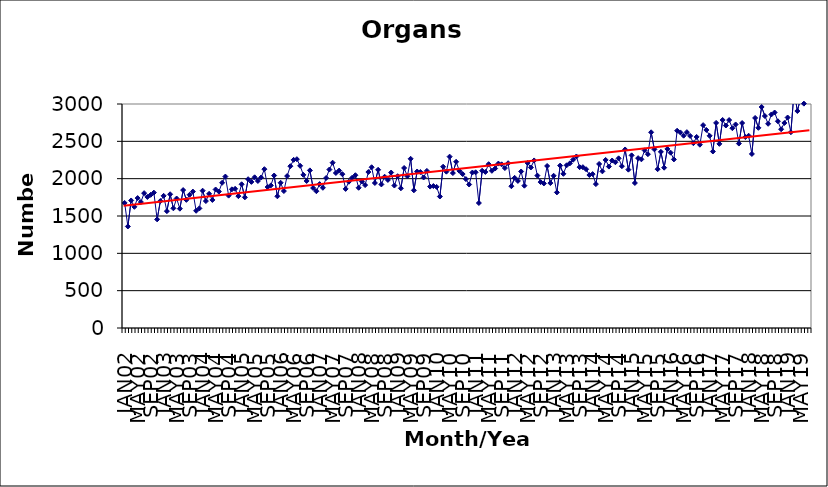
| Category | Series 0 |
|---|---|
| JAN02 | 1675 |
| FEB02 | 1360 |
| MAR02 | 1708 |
| APR02 | 1623 |
| MAY02 | 1740 |
| JUN02 | 1687 |
| JUL02 | 1806 |
| AUG02 | 1755 |
| SEP02 | 1783 |
| OCT02 | 1813 |
| NOV02 | 1455 |
| DEC02 | 1701 |
| JAN03 | 1770 |
| FEB03 | 1565 |
| MAR03 | 1791 |
| APR03 | 1603 |
| MAY03 | 1734 |
| JUN03 | 1598 |
| JUL03 | 1847 |
| AUG03 | 1716 |
| SEP03 | 1785 |
| OCT03 | 1827 |
| NOV03 | 1570 |
| DEC03 | 1602 |
| JAN04 | 1839 |
| FEB04 | 1700 |
| MAR04 | 1797 |
| APR04 | 1715 |
| MAY04 | 1855 |
| JUN04 | 1827 |
| JUL04 | 1945 |
| AUG04 | 2028 |
| SEP04 | 1773 |
| OCT04 | 1857 |
| NOV04 | 1864 |
| DEC04 | 1766 |
| JAN05 | 1925 |
| FEB05 | 1750 |
| MAR05 | 1993 |
| APR05 | 1957 |
| MAY05 | 2018 |
| JUN05 | 1969 |
| JUL05 | 2016 |
| AUG05 | 2127 |
| SEP05 | 1888 |
| OCT05 | 1910 |
| NOV05 | 2042 |
| DEC05 | 1764 |
| JAN06 | 1945 |
| FEB06 | 1834 |
| MAR06 | 2035 |
| APR06 | 2167 |
| MAY06 | 2252 |
| JUN06 | 2261 |
| JUL06 | 2172 |
| AUG06 | 2051 |
| SEP06 | 1969 |
| OCT06 | 2111 |
| NOV06 | 1875 |
| DEC06 | 1832 |
| JAN07 | 1927 |
| FEB07 | 1878 |
| MAR07 | 2009 |
| APR07 | 2122 |
| MAY07 | 2214 |
| JUN07 | 2076 |
| JUL07 | 2108 |
| AUG07 | 2060 |
| SEP07 | 1863 |
| OCT07 | 1959 |
| NOV07 | 2012 |
| DEC07 | 2046 |
| JAN08 | 1878 |
| FEB08 | 1962 |
| MAR08 | 1914 |
| APR08 | 2089 |
| MAY08 | 2153 |
| JUN08 | 1942 |
| JUL08 | 2119 |
| AUG08 | 1923 |
| SEP08 | 2026 |
| OCT08 | 1983 |
| NOV08 | 2082 |
| DEC08 | 1908 |
| JAN09 | 2033 |
| FEB09 | 1871 |
| MAR09 | 2143 |
| APR09 | 2032 |
| MAY09 | 2266 |
| JUN09 | 1844 |
| JUL09 | 2096 |
| AUG09 | 2089 |
| SEP09 | 2016 |
| OCT09 | 2104 |
| NOV09 | 1894 |
| DEC09 | 1901 |
| JAN10 | 1890 |
| FEB10 | 1761 |
| MAR10 | 2160 |
| APR10 | 2094 |
| MAY10 | 2295 |
| JUN10 | 2075 |
| JUL10 | 2226 |
| AUG10 | 2104 |
| SEP10 | 2062 |
| OCT10 | 1994 |
| NOV10 | 1922 |
| DEC10 | 2082 |
| JAN11 | 2085 |
| FEB11 | 1674 |
| MAR11 | 2106 |
| APR11 | 2090 |
| MAY11 | 2194 |
| JUN11 | 2105 |
| JUL11 | 2136 |
| AUG11 | 2202 |
| SEP11 | 2192 |
| OCT11 | 2142 |
| NOV11 | 2207 |
| DEC11 | 1899 |
| JAN12 | 2011 |
| FEB12 | 1970 |
| MAR12 | 2096 |
| APR12 | 1906 |
| MAY12 | 2210 |
| JUN12 | 2150 |
| JUL12 | 2244 |
| AUG12 | 2041 |
| SEP12 | 1954 |
| OCT12 | 1936 |
| NOV12 | 2170 |
| DEC12 | 1941 |
| JAN13 | 2039 |
| FEB13 | 1816 |
| MAR13 | 2175 |
| APR13 | 2065 |
| MAY13 | 2179 |
| JUN13 | 2205 |
| JUL13 | 2254 |
| AUG13 | 2297 |
| SEP13 | 2154 |
| OCT13 | 2154 |
| NOV13 | 2126 |
| DEC13 | 2049 |
| JAN14 | 2061 |
| FEB14 | 1927 |
| MAR14 | 2197 |
| APR14 | 2098 |
| MAY14 | 2251 |
| JUN14 | 2162 |
| JUL14 | 2243 |
| AUG14 | 2220 |
| SEP14 | 2272 |
| OCT14 | 2167 |
| NOV14 | 2391 |
| DEC14 | 2121 |
| JAN15 | 2312 |
| FEB15 | 1942 |
| MAR15 | 2275 |
| APR15 | 2259 |
| MAY15 | 2379 |
| JUN15 | 2328 |
| JUL15 | 2621 |
| AUG15 | 2393 |
| SEP15 | 2127 |
| OCT15 | 2359 |
| NOV15 | 2147 |
| DEC15 | 2398 |
| JAN16 | 2348 |
| FEB16 | 2258 |
| MAR16 | 2642 |
| APR16 | 2619 |
| MAY16 | 2576 |
| JUN16 | 2623 |
| JUL16 | 2573 |
| AUG16 | 2475 |
| SEP16 | 2559 |
| OCT16 | 2455 |
| NOV16 | 2717 |
| DEC16 | 2652 |
| JAN17 | 2574 |
| FEB17 | 2364 |
| MAR17 | 2747 |
| APR17 | 2466 |
| MAY17 | 2786 |
| JUN17 | 2712 |
| JUL17 | 2785 |
| AUG17 | 2676 |
| SEP17 | 2726 |
| OCT17 | 2470 |
| NOV17 | 2745 |
| DEC17 | 2557 |
| JAN18 | 2575 |
| FEB18 | 2331 |
| MAR18 | 2813 |
| APR18 | 2681 |
| MAY18 | 2960 |
| JUN18 | 2839 |
| JUL18 | 2735 |
| AUG18 | 2860 |
| SEP18 | 2886 |
| OCT18 | 2769 |
| NOV18 | 2662 |
| DEC18 | 2746 |
| JAN19 | 2819 |
| FEB19 | 2622 |
| MAR19 | 3175 |
| APR19 | 2906 |
| MAY19 | 3079 |
| JUN19 | 3005 |